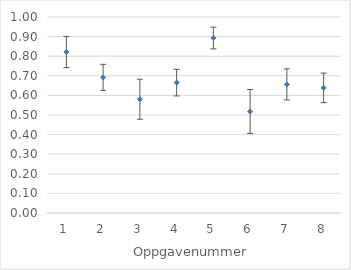
| Category | Series 0 |
|---|---|
| 0 | 0.821 |
| 1 | 0.692 |
| 2 | 0.58 |
| 3 | 0.665 |
| 4 | 0.893 |
| 5 | 0.518 |
| 6 | 0.656 |
| 7 | 0.638 |